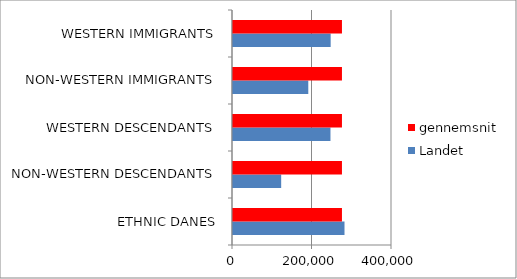
| Category | Landet | gennemsnit |
|---|---|---|
| ETHNIC DANES | 280500 | 274100 |
| NON-WESTERN DESCENDANTS | 121200 | 274100 |
| WESTERN DESCENDANTS | 245200 | 274100 |
| NON-WESTERN IMMIGRANTS | 189400 | 274100 |
| WESTERN IMMIGRANTS | 245700 | 274100 |